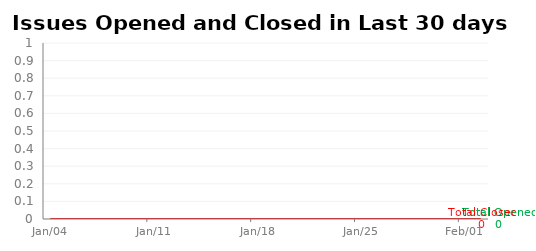
| Category | Total Opened | Total Closed |
|---|---|---|
| 2015-01-04 | 0 | 0 |
| 2015-01-05 | 0 | 0 |
| 2015-01-06 | 0 | 0 |
| 2015-01-07 | 0 | 0 |
| 2015-01-08 | 0 | 0 |
| 2015-01-09 | 0 | 0 |
| 2015-01-10 | 0 | 0 |
| 2015-01-11 | 0 | 0 |
| 2015-01-12 | 0 | 0 |
| 2015-01-13 | 0 | 0 |
| 2015-01-14 | 0 | 0 |
| 2015-01-15 | 0 | 0 |
| 2015-01-16 | 0 | 0 |
| 2015-01-17 | 0 | 0 |
| 2015-01-18 | 0 | 0 |
| 2015-01-19 | 0 | 0 |
| 2015-01-20 | 0 | 0 |
| 2015-01-21 | 0 | 0 |
| 2015-01-22 | 0 | 0 |
| 2015-01-23 | 0 | 0 |
| 2015-01-24 | 0 | 0 |
| 2015-01-25 | 0 | 0 |
| 2015-01-26 | 0 | 0 |
| 2015-01-27 | 0 | 0 |
| 2015-01-28 | 0 | 0 |
| 2015-01-29 | 0 | 0 |
| 2015-01-30 | 0 | 0 |
| 2015-01-31 | 0 | 0 |
| 2015-02-01 | 0 | 0 |
| 2015-02-02 | 0 | 0 |